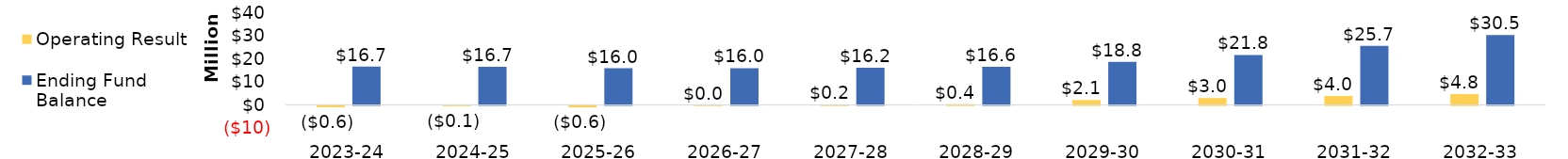
| Category | Operating Result | Ending Fund Balance |
|---|---|---|
| 2023-24 | -606612.692 | 16727208.308 |
| 2024-25 | -76415.156 | 16650793.153 |
| 2025-26 | -638136.24 | 16012656.913 |
| 2026-27 | 20076.524 | 16032733.437 |
| 2027-28 | 195614.825 | 16228348.263 |
| 2028-29 | 386289.956 | 16614638.218 |
| 2029-30 | 2137829.984 | 18752468.202 |
| 2030-31 | 3031301.109 | 21783769.311 |
| 2031-32 | 3951099.949 | 25734869.26 |
| 2032-33 | 4777721.417 | 30512590.676 |